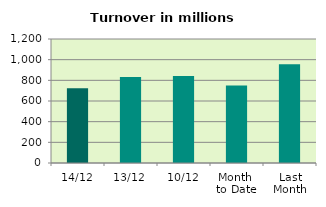
| Category | Series 0 |
|---|---|
| 14/12 | 723.449 |
| 13/12 | 831.376 |
| 10/12 | 840.982 |
| Month 
to Date | 750.386 |
| Last
Month | 954.978 |